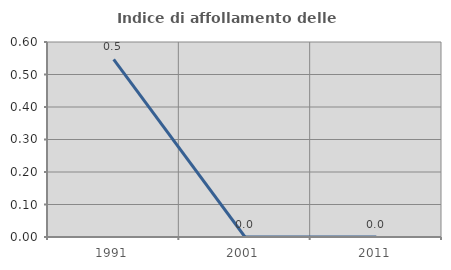
| Category | Indice di affollamento delle abitazioni  |
|---|---|
| 1991.0 | 0.546 |
| 2001.0 | 0 |
| 2011.0 | 0 |